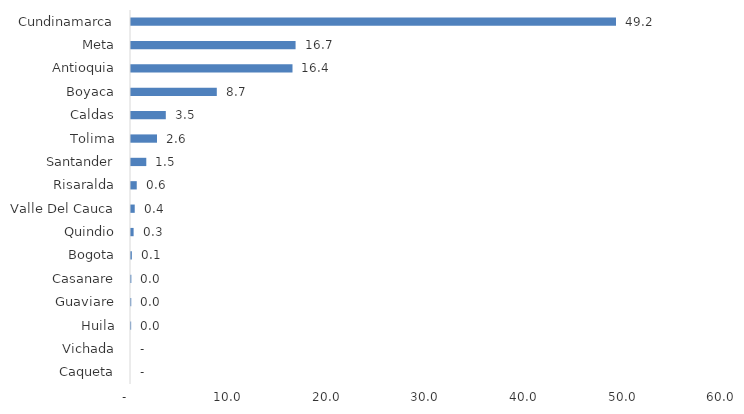
| Category | Series 0 |
|---|---|
| Caqueta | 0 |
| Vichada | 0 |
| Huila | 0.015 |
| Guaviare | 0.026 |
| Casanare | 0.035 |
| Bogota | 0.086 |
| Quindio | 0.264 |
| Valle Del Cauca | 0.378 |
| Risaralda | 0.583 |
| Santander | 1.55 |
| Tolima | 2.638 |
| Caldas | 3.527 |
| Boyaca | 8.696 |
| Antioquia | 16.368 |
| Meta | 16.68 |
| Cundinamarca | 49.155 |